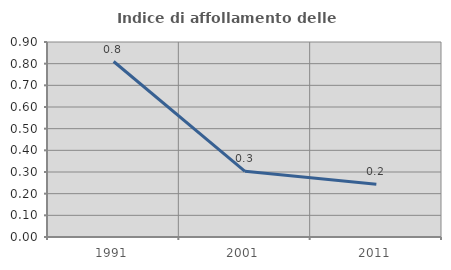
| Category | Indice di affollamento delle abitazioni  |
|---|---|
| 1991.0 | 0.81 |
| 2001.0 | 0.303 |
| 2011.0 | 0.243 |